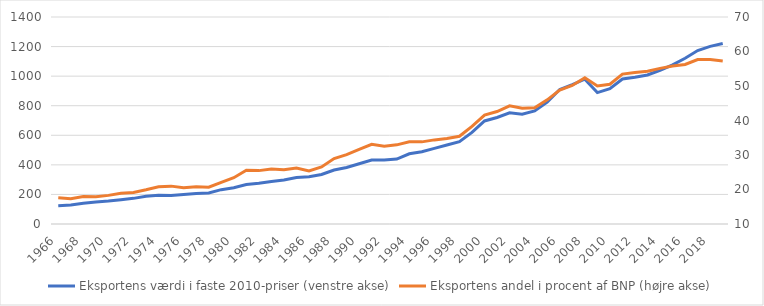
| Category | Eksportens værdi i faste 2010-priser (venstre akse) |
|---|---|
| 1966 | 123.6 |
| 1967 | 128.2 |
| 1968 | 140.7 |
| 1969 | 149.2 |
| 1970 | 154.9 |
| 1971 | 164.7 |
| 1972 | 173.4 |
| 1973 | 187.8 |
| 1974 | 194.2 |
| 1975 | 192.8 |
| 1976 | 199.5 |
| 1977 | 206.6 |
| 1978 | 209.5 |
| 1979 | 232.3 |
| 1980 | 245.3 |
| 1981 | 266.5 |
| 1982 | 275 |
| 1983 | 287.6 |
| 1984 | 297.1 |
| 1985 | 315 |
| 1986 | 319.2 |
| 1987 | 334.7 |
| 1988 | 365.3 |
| 1989 | 382.3 |
| 1990 | 407.3 |
| 1991 | 432.4 |
| 1992 | 433.6 |
| 1993 | 438.9 |
| 1994 | 475.1 |
| 1995 | 488.8 |
| 1996 | 511.5 |
| 1997 | 534.5 |
| 1998 | 556.4 |
| 1999 | 619.1 |
| 2000 | 696.9 |
| 2001 | 720.3 |
| 2002 | 751.7 |
| 2003 | 742.7 |
| 2004 | 765.1 |
| 2005 | 824.2 |
| 2006 | 909.4 |
| 2007 | 942.6 |
| 2008 | 979.1 |
| 2009 | 888.8 |
| 2010 | 914.9 |
| 2011 | 980.8 |
| 2012 | 992.2 |
| 2013 | 1008.1 |
| 2014 | 1039.7 |
| 2015 | 1076.9 |
| 2016 | 1121.2 |
| 2017 | 1173.1 |
| 2018 | 1201.2 |
| 2019 | 1220.3 |